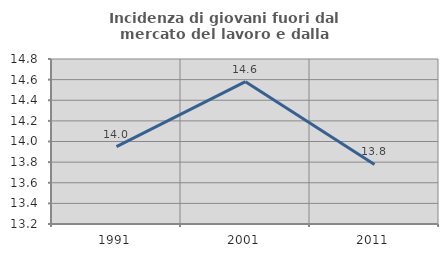
| Category | Incidenza di giovani fuori dal mercato del lavoro e dalla formazione  |
|---|---|
| 1991.0 | 13.95 |
| 2001.0 | 14.58 |
| 2011.0 | 13.778 |